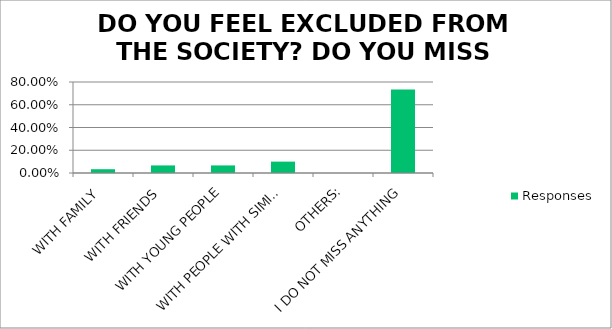
| Category | Responses |
|---|---|
| WITH FAMILY | 0.033 |
| WITH FRIENDS | 0.067 |
| WITH YOUNG PEOPLE | 0.067 |
| WITH PEOPLE WITH SIMILAR INTERESTS | 0.1 |
| OTHERS: | 0 |
| I DO NOT MISS ANYTHING | 0.733 |